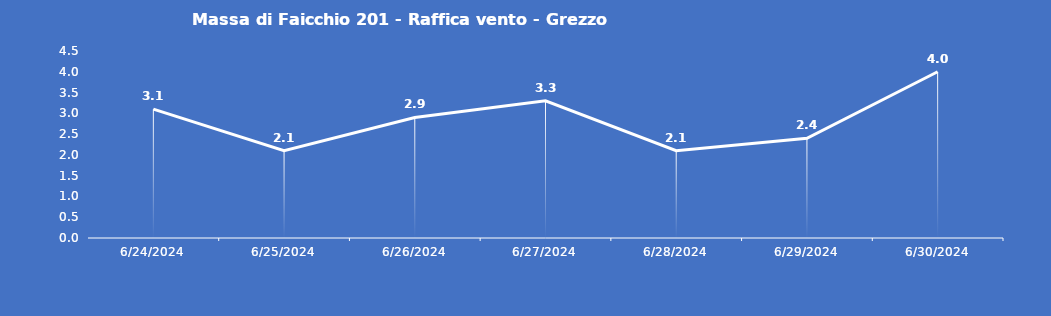
| Category | Massa di Faicchio 201 - Raffica vento - Grezzo (m/s) |
|---|---|
| 6/24/24 | 3.1 |
| 6/25/24 | 2.1 |
| 6/26/24 | 2.9 |
| 6/27/24 | 3.3 |
| 6/28/24 | 2.1 |
| 6/29/24 | 2.4 |
| 6/30/24 | 4 |